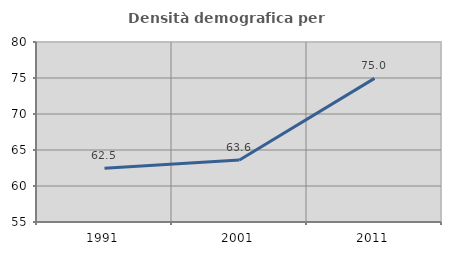
| Category | Densità demografica |
|---|---|
| 1991.0 | 62.46 |
| 2001.0 | 63.617 |
| 2011.0 | 74.952 |